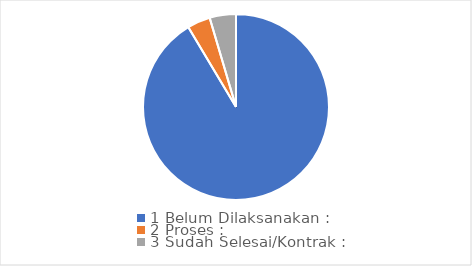
| Category | Series 0 |
|---|---|
| 0 | 160 |
| 1 | 7 |
| 2 | 8 |